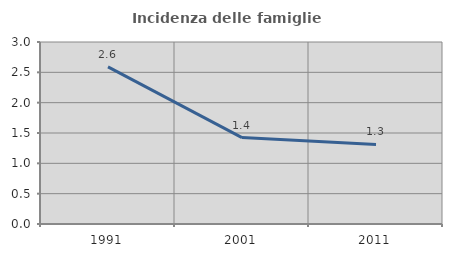
| Category | Incidenza delle famiglie numerose |
|---|---|
| 1991.0 | 2.59 |
| 2001.0 | 1.424 |
| 2011.0 | 1.312 |